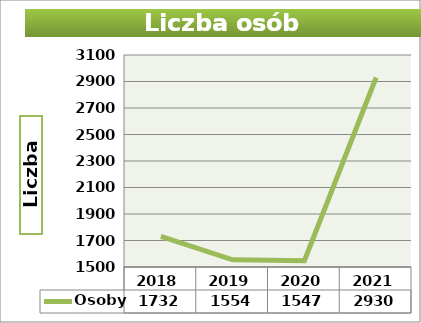
| Category | Osoby |
|---|---|
| 2018 | 1732 |
| 2019 | 1554 |
| 2020 | 1547 |
| 2021 | 2930 |